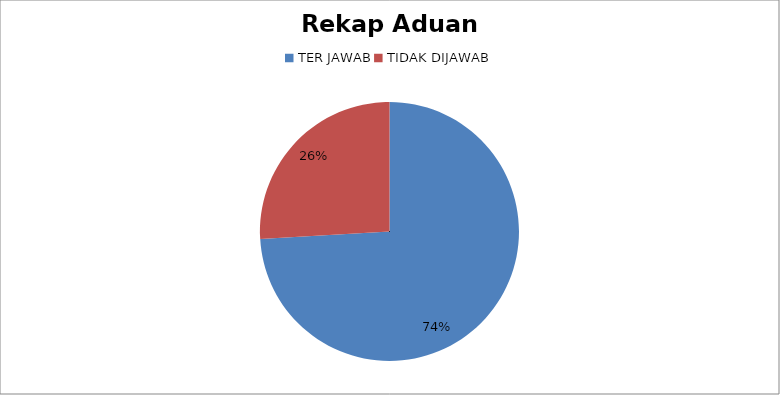
| Category | Series 0 |
|---|---|
| TER JAWAB | 60 |
| TIDAK DIJAWAB | 21 |